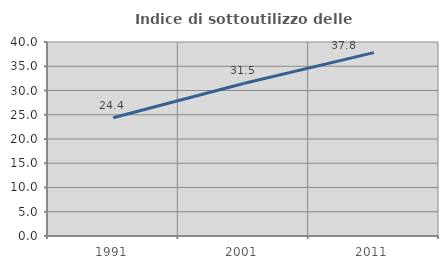
| Category | Indice di sottoutilizzo delle abitazioni  |
|---|---|
| 1991.0 | 24.388 |
| 2001.0 | 31.455 |
| 2011.0 | 37.816 |